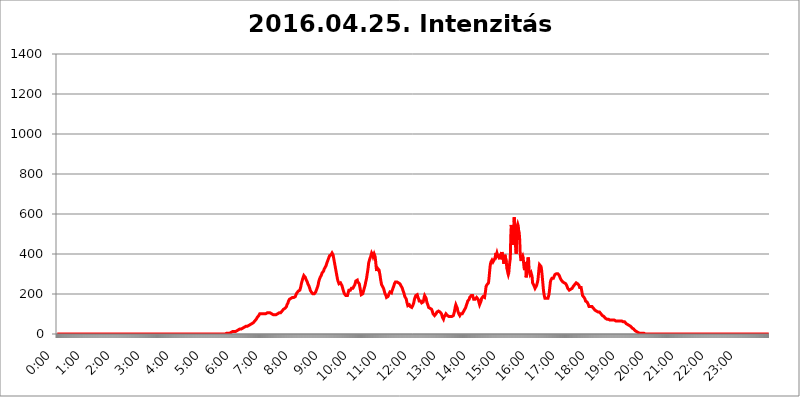
| Category | 2016.04.25. Intenzitás [W/m^2] |
|---|---|
| 0.0 | 0 |
| 0.0006944444444444445 | 0 |
| 0.001388888888888889 | 0 |
| 0.0020833333333333333 | 0 |
| 0.002777777777777778 | 0 |
| 0.003472222222222222 | 0 |
| 0.004166666666666667 | 0 |
| 0.004861111111111111 | 0 |
| 0.005555555555555556 | 0 |
| 0.0062499999999999995 | 0 |
| 0.006944444444444444 | 0 |
| 0.007638888888888889 | 0 |
| 0.008333333333333333 | 0 |
| 0.009027777777777779 | 0 |
| 0.009722222222222222 | 0 |
| 0.010416666666666666 | 0 |
| 0.011111111111111112 | 0 |
| 0.011805555555555555 | 0 |
| 0.012499999999999999 | 0 |
| 0.013194444444444444 | 0 |
| 0.013888888888888888 | 0 |
| 0.014583333333333332 | 0 |
| 0.015277777777777777 | 0 |
| 0.015972222222222224 | 0 |
| 0.016666666666666666 | 0 |
| 0.017361111111111112 | 0 |
| 0.018055555555555557 | 0 |
| 0.01875 | 0 |
| 0.019444444444444445 | 0 |
| 0.02013888888888889 | 0 |
| 0.020833333333333332 | 0 |
| 0.02152777777777778 | 0 |
| 0.022222222222222223 | 0 |
| 0.02291666666666667 | 0 |
| 0.02361111111111111 | 0 |
| 0.024305555555555556 | 0 |
| 0.024999999999999998 | 0 |
| 0.025694444444444447 | 0 |
| 0.02638888888888889 | 0 |
| 0.027083333333333334 | 0 |
| 0.027777777777777776 | 0 |
| 0.02847222222222222 | 0 |
| 0.029166666666666664 | 0 |
| 0.029861111111111113 | 0 |
| 0.030555555555555555 | 0 |
| 0.03125 | 0 |
| 0.03194444444444445 | 0 |
| 0.03263888888888889 | 0 |
| 0.03333333333333333 | 0 |
| 0.034027777777777775 | 0 |
| 0.034722222222222224 | 0 |
| 0.035416666666666666 | 0 |
| 0.036111111111111115 | 0 |
| 0.03680555555555556 | 0 |
| 0.0375 | 0 |
| 0.03819444444444444 | 0 |
| 0.03888888888888889 | 0 |
| 0.03958333333333333 | 0 |
| 0.04027777777777778 | 0 |
| 0.04097222222222222 | 0 |
| 0.041666666666666664 | 0 |
| 0.042361111111111106 | 0 |
| 0.04305555555555556 | 0 |
| 0.043750000000000004 | 0 |
| 0.044444444444444446 | 0 |
| 0.04513888888888889 | 0 |
| 0.04583333333333334 | 0 |
| 0.04652777777777778 | 0 |
| 0.04722222222222222 | 0 |
| 0.04791666666666666 | 0 |
| 0.04861111111111111 | 0 |
| 0.049305555555555554 | 0 |
| 0.049999999999999996 | 0 |
| 0.05069444444444445 | 0 |
| 0.051388888888888894 | 0 |
| 0.052083333333333336 | 0 |
| 0.05277777777777778 | 0 |
| 0.05347222222222222 | 0 |
| 0.05416666666666667 | 0 |
| 0.05486111111111111 | 0 |
| 0.05555555555555555 | 0 |
| 0.05625 | 0 |
| 0.05694444444444444 | 0 |
| 0.057638888888888885 | 0 |
| 0.05833333333333333 | 0 |
| 0.05902777777777778 | 0 |
| 0.059722222222222225 | 0 |
| 0.06041666666666667 | 0 |
| 0.061111111111111116 | 0 |
| 0.06180555555555556 | 0 |
| 0.0625 | 0 |
| 0.06319444444444444 | 0 |
| 0.06388888888888888 | 0 |
| 0.06458333333333334 | 0 |
| 0.06527777777777778 | 0 |
| 0.06597222222222222 | 0 |
| 0.06666666666666667 | 0 |
| 0.06736111111111111 | 0 |
| 0.06805555555555555 | 0 |
| 0.06874999999999999 | 0 |
| 0.06944444444444443 | 0 |
| 0.07013888888888889 | 0 |
| 0.07083333333333333 | 0 |
| 0.07152777777777779 | 0 |
| 0.07222222222222223 | 0 |
| 0.07291666666666667 | 0 |
| 0.07361111111111111 | 0 |
| 0.07430555555555556 | 0 |
| 0.075 | 0 |
| 0.07569444444444444 | 0 |
| 0.0763888888888889 | 0 |
| 0.07708333333333334 | 0 |
| 0.07777777777777778 | 0 |
| 0.07847222222222222 | 0 |
| 0.07916666666666666 | 0 |
| 0.0798611111111111 | 0 |
| 0.08055555555555556 | 0 |
| 0.08125 | 0 |
| 0.08194444444444444 | 0 |
| 0.08263888888888889 | 0 |
| 0.08333333333333333 | 0 |
| 0.08402777777777777 | 0 |
| 0.08472222222222221 | 0 |
| 0.08541666666666665 | 0 |
| 0.08611111111111112 | 0 |
| 0.08680555555555557 | 0 |
| 0.08750000000000001 | 0 |
| 0.08819444444444445 | 0 |
| 0.08888888888888889 | 0 |
| 0.08958333333333333 | 0 |
| 0.09027777777777778 | 0 |
| 0.09097222222222222 | 0 |
| 0.09166666666666667 | 0 |
| 0.09236111111111112 | 0 |
| 0.09305555555555556 | 0 |
| 0.09375 | 0 |
| 0.09444444444444444 | 0 |
| 0.09513888888888888 | 0 |
| 0.09583333333333333 | 0 |
| 0.09652777777777777 | 0 |
| 0.09722222222222222 | 0 |
| 0.09791666666666667 | 0 |
| 0.09861111111111111 | 0 |
| 0.09930555555555555 | 0 |
| 0.09999999999999999 | 0 |
| 0.10069444444444443 | 0 |
| 0.1013888888888889 | 0 |
| 0.10208333333333335 | 0 |
| 0.10277777777777779 | 0 |
| 0.10347222222222223 | 0 |
| 0.10416666666666667 | 0 |
| 0.10486111111111111 | 0 |
| 0.10555555555555556 | 0 |
| 0.10625 | 0 |
| 0.10694444444444444 | 0 |
| 0.1076388888888889 | 0 |
| 0.10833333333333334 | 0 |
| 0.10902777777777778 | 0 |
| 0.10972222222222222 | 0 |
| 0.1111111111111111 | 0 |
| 0.11180555555555556 | 0 |
| 0.11180555555555556 | 0 |
| 0.1125 | 0 |
| 0.11319444444444444 | 0 |
| 0.11388888888888889 | 0 |
| 0.11458333333333333 | 0 |
| 0.11527777777777777 | 0 |
| 0.11597222222222221 | 0 |
| 0.11666666666666665 | 0 |
| 0.1173611111111111 | 0 |
| 0.11805555555555557 | 0 |
| 0.11944444444444445 | 0 |
| 0.12013888888888889 | 0 |
| 0.12083333333333333 | 0 |
| 0.12152777777777778 | 0 |
| 0.12222222222222223 | 0 |
| 0.12291666666666667 | 0 |
| 0.12291666666666667 | 0 |
| 0.12361111111111112 | 0 |
| 0.12430555555555556 | 0 |
| 0.125 | 0 |
| 0.12569444444444444 | 0 |
| 0.12638888888888888 | 0 |
| 0.12708333333333333 | 0 |
| 0.16875 | 0 |
| 0.12847222222222224 | 0 |
| 0.12916666666666668 | 0 |
| 0.12986111111111112 | 0 |
| 0.13055555555555556 | 0 |
| 0.13125 | 0 |
| 0.13194444444444445 | 0 |
| 0.1326388888888889 | 0 |
| 0.13333333333333333 | 0 |
| 0.13402777777777777 | 0 |
| 0.13402777777777777 | 0 |
| 0.13472222222222222 | 0 |
| 0.13541666666666666 | 0 |
| 0.1361111111111111 | 0 |
| 0.13749999999999998 | 0 |
| 0.13819444444444443 | 0 |
| 0.1388888888888889 | 0 |
| 0.13958333333333334 | 0 |
| 0.14027777777777778 | 0 |
| 0.14097222222222222 | 0 |
| 0.14166666666666666 | 0 |
| 0.1423611111111111 | 0 |
| 0.14305555555555557 | 0 |
| 0.14375000000000002 | 0 |
| 0.14444444444444446 | 0 |
| 0.1451388888888889 | 0 |
| 0.1451388888888889 | 0 |
| 0.14652777777777778 | 0 |
| 0.14722222222222223 | 0 |
| 0.14791666666666667 | 0 |
| 0.1486111111111111 | 0 |
| 0.14930555555555555 | 0 |
| 0.15 | 0 |
| 0.15069444444444444 | 0 |
| 0.15138888888888888 | 0 |
| 0.15208333333333332 | 0 |
| 0.15277777777777776 | 0 |
| 0.15347222222222223 | 0 |
| 0.15416666666666667 | 0 |
| 0.15486111111111112 | 0 |
| 0.15555555555555556 | 0 |
| 0.15625 | 0 |
| 0.15694444444444444 | 0 |
| 0.15763888888888888 | 0 |
| 0.15833333333333333 | 0 |
| 0.15902777777777777 | 0 |
| 0.15972222222222224 | 0 |
| 0.16041666666666668 | 0 |
| 0.16111111111111112 | 0 |
| 0.16180555555555556 | 0 |
| 0.1625 | 0 |
| 0.16319444444444445 | 0 |
| 0.1638888888888889 | 0 |
| 0.16458333333333333 | 0 |
| 0.16527777777777777 | 0 |
| 0.16597222222222222 | 0 |
| 0.16666666666666666 | 0 |
| 0.1673611111111111 | 0 |
| 0.16805555555555554 | 0 |
| 0.16874999999999998 | 0 |
| 0.16944444444444443 | 0 |
| 0.17013888888888887 | 0 |
| 0.1708333333333333 | 0 |
| 0.17152777777777775 | 0 |
| 0.17222222222222225 | 0 |
| 0.1729166666666667 | 0 |
| 0.17361111111111113 | 0 |
| 0.17430555555555557 | 0 |
| 0.17500000000000002 | 0 |
| 0.17569444444444446 | 0 |
| 0.1763888888888889 | 0 |
| 0.17708333333333334 | 0 |
| 0.17777777777777778 | 0 |
| 0.17847222222222223 | 0 |
| 0.17916666666666667 | 0 |
| 0.1798611111111111 | 0 |
| 0.18055555555555555 | 0 |
| 0.18125 | 0 |
| 0.18194444444444444 | 0 |
| 0.1826388888888889 | 0 |
| 0.18333333333333335 | 0 |
| 0.1840277777777778 | 0 |
| 0.18472222222222223 | 0 |
| 0.18541666666666667 | 0 |
| 0.18611111111111112 | 0 |
| 0.18680555555555556 | 0 |
| 0.1875 | 0 |
| 0.18819444444444444 | 0 |
| 0.18888888888888888 | 0 |
| 0.18958333333333333 | 0 |
| 0.19027777777777777 | 0 |
| 0.1909722222222222 | 0 |
| 0.19166666666666665 | 0 |
| 0.19236111111111112 | 0 |
| 0.19305555555555554 | 0 |
| 0.19375 | 0 |
| 0.19444444444444445 | 0 |
| 0.1951388888888889 | 0 |
| 0.19583333333333333 | 0 |
| 0.19652777777777777 | 0 |
| 0.19722222222222222 | 0 |
| 0.19791666666666666 | 0 |
| 0.1986111111111111 | 0 |
| 0.19930555555555554 | 0 |
| 0.19999999999999998 | 0 |
| 0.20069444444444443 | 0 |
| 0.20138888888888887 | 0 |
| 0.2020833333333333 | 0 |
| 0.2027777777777778 | 0 |
| 0.2034722222222222 | 0 |
| 0.2041666666666667 | 0 |
| 0.20486111111111113 | 0 |
| 0.20555555555555557 | 0 |
| 0.20625000000000002 | 0 |
| 0.20694444444444446 | 0 |
| 0.2076388888888889 | 0 |
| 0.20833333333333334 | 0 |
| 0.20902777777777778 | 0 |
| 0.20972222222222223 | 0 |
| 0.21041666666666667 | 0 |
| 0.2111111111111111 | 0 |
| 0.21180555555555555 | 0 |
| 0.2125 | 0 |
| 0.21319444444444444 | 0 |
| 0.2138888888888889 | 0 |
| 0.21458333333333335 | 0 |
| 0.2152777777777778 | 0 |
| 0.21597222222222223 | 0 |
| 0.21666666666666667 | 0 |
| 0.21736111111111112 | 0 |
| 0.21805555555555556 | 0 |
| 0.21875 | 0 |
| 0.21944444444444444 | 0 |
| 0.22013888888888888 | 0 |
| 0.22083333333333333 | 0 |
| 0.22152777777777777 | 0 |
| 0.2222222222222222 | 0 |
| 0.22291666666666665 | 0 |
| 0.2236111111111111 | 0 |
| 0.22430555555555556 | 0 |
| 0.225 | 0 |
| 0.22569444444444445 | 0 |
| 0.2263888888888889 | 0 |
| 0.22708333333333333 | 0 |
| 0.22777777777777777 | 0 |
| 0.22847222222222222 | 0 |
| 0.22916666666666666 | 0 |
| 0.2298611111111111 | 0 |
| 0.23055555555555554 | 0 |
| 0.23124999999999998 | 0 |
| 0.23194444444444443 | 0 |
| 0.23263888888888887 | 0 |
| 0.2333333333333333 | 0 |
| 0.2340277777777778 | 0 |
| 0.2347222222222222 | 0 |
| 0.2354166666666667 | 0 |
| 0.23611111111111113 | 0 |
| 0.23680555555555557 | 3.525 |
| 0.23750000000000002 | 3.525 |
| 0.23819444444444446 | 3.525 |
| 0.2388888888888889 | 3.525 |
| 0.23958333333333334 | 3.525 |
| 0.24027777777777778 | 3.525 |
| 0.24097222222222223 | 3.525 |
| 0.24166666666666667 | 3.525 |
| 0.2423611111111111 | 7.887 |
| 0.24305555555555555 | 7.887 |
| 0.24375 | 7.887 |
| 0.24444444444444446 | 7.887 |
| 0.24513888888888888 | 7.887 |
| 0.24583333333333335 | 12.257 |
| 0.2465277777777778 | 12.257 |
| 0.24722222222222223 | 12.257 |
| 0.24791666666666667 | 12.257 |
| 0.24861111111111112 | 12.257 |
| 0.24930555555555556 | 12.257 |
| 0.25 | 12.257 |
| 0.25069444444444444 | 16.636 |
| 0.2513888888888889 | 16.636 |
| 0.2520833333333333 | 16.636 |
| 0.25277777777777777 | 16.636 |
| 0.2534722222222222 | 21.024 |
| 0.25416666666666665 | 21.024 |
| 0.2548611111111111 | 21.024 |
| 0.2555555555555556 | 21.024 |
| 0.25625000000000003 | 25.419 |
| 0.2569444444444445 | 25.419 |
| 0.2576388888888889 | 25.419 |
| 0.25833333333333336 | 25.419 |
| 0.2590277777777778 | 29.823 |
| 0.25972222222222224 | 29.823 |
| 0.2604166666666667 | 29.823 |
| 0.2611111111111111 | 29.823 |
| 0.26180555555555557 | 29.823 |
| 0.2625 | 34.234 |
| 0.26319444444444445 | 34.234 |
| 0.2638888888888889 | 34.234 |
| 0.26458333333333334 | 38.653 |
| 0.2652777777777778 | 38.653 |
| 0.2659722222222222 | 38.653 |
| 0.26666666666666666 | 38.653 |
| 0.2673611111111111 | 43.079 |
| 0.26805555555555555 | 43.079 |
| 0.26875 | 43.079 |
| 0.26944444444444443 | 43.079 |
| 0.2701388888888889 | 47.511 |
| 0.2708333333333333 | 47.511 |
| 0.27152777777777776 | 47.511 |
| 0.2722222222222222 | 47.511 |
| 0.27291666666666664 | 51.951 |
| 0.2736111111111111 | 51.951 |
| 0.2743055555555555 | 56.398 |
| 0.27499999999999997 | 56.398 |
| 0.27569444444444446 | 60.85 |
| 0.27638888888888885 | 60.85 |
| 0.27708333333333335 | 65.31 |
| 0.2777777777777778 | 69.775 |
| 0.27847222222222223 | 69.775 |
| 0.2791666666666667 | 74.246 |
| 0.2798611111111111 | 78.722 |
| 0.28055555555555556 | 83.205 |
| 0.28125 | 83.205 |
| 0.28194444444444444 | 87.692 |
| 0.2826388888888889 | 92.184 |
| 0.2833333333333333 | 96.682 |
| 0.28402777777777777 | 101.184 |
| 0.2847222222222222 | 101.184 |
| 0.28541666666666665 | 101.184 |
| 0.28611111111111115 | 101.184 |
| 0.28680555555555554 | 101.184 |
| 0.28750000000000003 | 101.184 |
| 0.2881944444444445 | 101.184 |
| 0.2888888888888889 | 101.184 |
| 0.28958333333333336 | 101.184 |
| 0.2902777777777778 | 101.184 |
| 0.29097222222222224 | 101.184 |
| 0.2916666666666667 | 101.184 |
| 0.2923611111111111 | 101.184 |
| 0.29305555555555557 | 101.184 |
| 0.29375 | 101.184 |
| 0.29444444444444445 | 105.69 |
| 0.2951388888888889 | 105.69 |
| 0.29583333333333334 | 105.69 |
| 0.2965277777777778 | 105.69 |
| 0.2972222222222222 | 105.69 |
| 0.29791666666666666 | 105.69 |
| 0.2986111111111111 | 105.69 |
| 0.29930555555555555 | 105.69 |
| 0.3 | 101.184 |
| 0.30069444444444443 | 101.184 |
| 0.3013888888888889 | 101.184 |
| 0.3020833333333333 | 96.682 |
| 0.30277777777777776 | 96.682 |
| 0.3034722222222222 | 96.682 |
| 0.30416666666666664 | 96.682 |
| 0.3048611111111111 | 96.682 |
| 0.3055555555555555 | 96.682 |
| 0.30624999999999997 | 96.682 |
| 0.3069444444444444 | 96.682 |
| 0.3076388888888889 | 101.184 |
| 0.30833333333333335 | 101.184 |
| 0.3090277777777778 | 101.184 |
| 0.30972222222222223 | 105.69 |
| 0.3104166666666667 | 105.69 |
| 0.3111111111111111 | 105.69 |
| 0.31180555555555556 | 105.69 |
| 0.3125 | 110.201 |
| 0.31319444444444444 | 105.69 |
| 0.3138888888888889 | 110.201 |
| 0.3145833333333333 | 110.201 |
| 0.31527777777777777 | 114.716 |
| 0.3159722222222222 | 119.235 |
| 0.31666666666666665 | 119.235 |
| 0.31736111111111115 | 123.758 |
| 0.31805555555555554 | 128.284 |
| 0.31875000000000003 | 128.284 |
| 0.3194444444444445 | 128.284 |
| 0.3201388888888889 | 132.814 |
| 0.32083333333333336 | 132.814 |
| 0.3215277777777778 | 137.347 |
| 0.32222222222222224 | 146.423 |
| 0.3229166666666667 | 150.964 |
| 0.3236111111111111 | 155.509 |
| 0.32430555555555557 | 164.605 |
| 0.325 | 169.156 |
| 0.32569444444444445 | 173.709 |
| 0.3263888888888889 | 173.709 |
| 0.32708333333333334 | 173.709 |
| 0.3277777777777778 | 178.264 |
| 0.3284722222222222 | 178.264 |
| 0.32916666666666666 | 178.264 |
| 0.3298611111111111 | 182.82 |
| 0.33055555555555555 | 182.82 |
| 0.33125 | 182.82 |
| 0.33194444444444443 | 182.82 |
| 0.3326388888888889 | 182.82 |
| 0.3333333333333333 | 182.82 |
| 0.3340277777777778 | 187.378 |
| 0.3347222222222222 | 196.497 |
| 0.3354166666666667 | 201.058 |
| 0.3361111111111111 | 205.62 |
| 0.3368055555555556 | 210.182 |
| 0.33749999999999997 | 210.182 |
| 0.33819444444444446 | 214.746 |
| 0.33888888888888885 | 219.309 |
| 0.33958333333333335 | 219.309 |
| 0.34027777777777773 | 219.309 |
| 0.34097222222222223 | 228.436 |
| 0.3416666666666666 | 237.564 |
| 0.3423611111111111 | 251.251 |
| 0.3430555555555555 | 260.373 |
| 0.34375 | 269.49 |
| 0.3444444444444445 | 278.603 |
| 0.3451388888888889 | 283.156 |
| 0.3458333333333334 | 292.259 |
| 0.34652777777777777 | 292.259 |
| 0.34722222222222227 | 287.709 |
| 0.34791666666666665 | 283.156 |
| 0.34861111111111115 | 278.603 |
| 0.34930555555555554 | 269.49 |
| 0.35000000000000003 | 264.932 |
| 0.3506944444444444 | 260.373 |
| 0.3513888888888889 | 251.251 |
| 0.3520833333333333 | 246.689 |
| 0.3527777777777778 | 242.127 |
| 0.3534722222222222 | 237.564 |
| 0.3541666666666667 | 228.436 |
| 0.3548611111111111 | 219.309 |
| 0.35555555555555557 | 214.746 |
| 0.35625 | 210.182 |
| 0.35694444444444445 | 205.62 |
| 0.3576388888888889 | 205.62 |
| 0.35833333333333334 | 201.058 |
| 0.3590277777777778 | 201.058 |
| 0.3597222222222222 | 201.058 |
| 0.36041666666666666 | 201.058 |
| 0.3611111111111111 | 201.058 |
| 0.36180555555555555 | 205.62 |
| 0.3625 | 210.182 |
| 0.36319444444444443 | 214.746 |
| 0.3638888888888889 | 223.873 |
| 0.3645833333333333 | 228.436 |
| 0.3652777777777778 | 237.564 |
| 0.3659722222222222 | 246.689 |
| 0.3666666666666667 | 260.373 |
| 0.3673611111111111 | 269.49 |
| 0.3680555555555556 | 274.047 |
| 0.36874999999999997 | 283.156 |
| 0.36944444444444446 | 287.709 |
| 0.37013888888888885 | 292.259 |
| 0.37083333333333335 | 296.808 |
| 0.37152777777777773 | 305.898 |
| 0.37222222222222223 | 305.898 |
| 0.3729166666666666 | 310.44 |
| 0.3736111111111111 | 314.98 |
| 0.3743055555555555 | 324.052 |
| 0.375 | 328.584 |
| 0.3756944444444445 | 333.113 |
| 0.3763888888888889 | 333.113 |
| 0.3770833333333334 | 342.162 |
| 0.37777777777777777 | 351.198 |
| 0.37847222222222227 | 355.712 |
| 0.37916666666666665 | 364.728 |
| 0.37986111111111115 | 369.23 |
| 0.38055555555555554 | 378.224 |
| 0.38125000000000003 | 382.715 |
| 0.3819444444444444 | 391.685 |
| 0.3826388888888889 | 396.164 |
| 0.3833333333333333 | 396.164 |
| 0.3840277777777778 | 396.164 |
| 0.3847222222222222 | 400.638 |
| 0.3854166666666667 | 405.108 |
| 0.3861111111111111 | 405.108 |
| 0.38680555555555557 | 396.164 |
| 0.3875 | 382.715 |
| 0.38819444444444445 | 369.23 |
| 0.3888888888888889 | 355.712 |
| 0.38958333333333334 | 342.162 |
| 0.3902777777777778 | 328.584 |
| 0.3909722222222222 | 314.98 |
| 0.39166666666666666 | 301.354 |
| 0.3923611111111111 | 287.709 |
| 0.39305555555555555 | 274.047 |
| 0.39375 | 264.932 |
| 0.39444444444444443 | 260.373 |
| 0.3951388888888889 | 251.251 |
| 0.3958333333333333 | 251.251 |
| 0.3965277777777778 | 251.251 |
| 0.3972222222222222 | 255.813 |
| 0.3979166666666667 | 255.813 |
| 0.3986111111111111 | 251.251 |
| 0.3993055555555556 | 242.127 |
| 0.39999999999999997 | 233 |
| 0.40069444444444446 | 223.873 |
| 0.40138888888888885 | 214.746 |
| 0.40208333333333335 | 210.182 |
| 0.40277777777777773 | 201.058 |
| 0.40347222222222223 | 196.497 |
| 0.4041666666666666 | 196.497 |
| 0.4048611111111111 | 191.937 |
| 0.4055555555555555 | 187.378 |
| 0.40625 | 187.378 |
| 0.4069444444444445 | 191.937 |
| 0.4076388888888889 | 201.058 |
| 0.4083333333333334 | 210.182 |
| 0.40902777777777777 | 219.309 |
| 0.40972222222222227 | 219.309 |
| 0.41041666666666665 | 219.309 |
| 0.41111111111111115 | 219.309 |
| 0.41180555555555554 | 223.873 |
| 0.41250000000000003 | 228.436 |
| 0.4131944444444444 | 233 |
| 0.4138888888888889 | 233 |
| 0.4145833333333333 | 228.436 |
| 0.4152777777777778 | 233 |
| 0.4159722222222222 | 237.564 |
| 0.4166666666666667 | 242.127 |
| 0.4173611111111111 | 246.689 |
| 0.41805555555555557 | 251.251 |
| 0.41875 | 264.932 |
| 0.41944444444444445 | 269.49 |
| 0.4201388888888889 | 269.49 |
| 0.42083333333333334 | 269.49 |
| 0.4215277777777778 | 260.373 |
| 0.4222222222222222 | 255.813 |
| 0.42291666666666666 | 255.813 |
| 0.4236111111111111 | 251.251 |
| 0.42430555555555555 | 237.564 |
| 0.425 | 223.873 |
| 0.42569444444444443 | 210.182 |
| 0.4263888888888889 | 196.497 |
| 0.4270833333333333 | 196.497 |
| 0.4277777777777778 | 196.497 |
| 0.4284722222222222 | 201.058 |
| 0.4291666666666667 | 210.182 |
| 0.4298611111111111 | 219.309 |
| 0.4305555555555556 | 228.436 |
| 0.43124999999999997 | 233 |
| 0.43194444444444446 | 246.689 |
| 0.43263888888888885 | 260.373 |
| 0.43333333333333335 | 269.49 |
| 0.43402777777777773 | 283.156 |
| 0.43472222222222223 | 301.354 |
| 0.4354166666666666 | 314.98 |
| 0.4361111111111111 | 333.113 |
| 0.4368055555555555 | 355.712 |
| 0.4375 | 364.728 |
| 0.4381944444444445 | 373.729 |
| 0.4388888888888889 | 378.224 |
| 0.4395833333333334 | 387.202 |
| 0.44027777777777777 | 396.164 |
| 0.44097222222222227 | 405.108 |
| 0.44166666666666665 | 409.574 |
| 0.44236111111111115 | 396.164 |
| 0.44305555555555554 | 387.202 |
| 0.44375000000000003 | 391.685 |
| 0.4444444444444444 | 400.638 |
| 0.4451388888888889 | 396.164 |
| 0.4458333333333333 | 387.202 |
| 0.4465277777777778 | 364.728 |
| 0.4472222222222222 | 337.639 |
| 0.4479166666666667 | 314.98 |
| 0.4486111111111111 | 314.98 |
| 0.44930555555555557 | 328.584 |
| 0.45 | 333.113 |
| 0.45069444444444445 | 324.052 |
| 0.4513888888888889 | 319.517 |
| 0.45208333333333334 | 305.898 |
| 0.4527777777777778 | 292.259 |
| 0.4534722222222222 | 274.047 |
| 0.45416666666666666 | 260.373 |
| 0.4548611111111111 | 246.689 |
| 0.45555555555555555 | 242.127 |
| 0.45625 | 237.564 |
| 0.45694444444444443 | 233 |
| 0.4576388888888889 | 228.436 |
| 0.4583333333333333 | 219.309 |
| 0.4590277777777778 | 210.182 |
| 0.4597222222222222 | 201.058 |
| 0.4604166666666667 | 196.497 |
| 0.4611111111111111 | 191.937 |
| 0.4618055555555556 | 182.82 |
| 0.46249999999999997 | 182.82 |
| 0.46319444444444446 | 182.82 |
| 0.46388888888888885 | 187.378 |
| 0.46458333333333335 | 191.937 |
| 0.46527777777777773 | 201.058 |
| 0.46597222222222223 | 205.62 |
| 0.4666666666666666 | 210.182 |
| 0.4673611111111111 | 205.62 |
| 0.4680555555555555 | 205.62 |
| 0.46875 | 205.62 |
| 0.4694444444444445 | 214.746 |
| 0.4701388888888889 | 219.309 |
| 0.4708333333333334 | 228.436 |
| 0.47152777777777777 | 233 |
| 0.47222222222222227 | 242.127 |
| 0.47291666666666665 | 251.251 |
| 0.47361111111111115 | 255.813 |
| 0.47430555555555554 | 260.373 |
| 0.47500000000000003 | 260.373 |
| 0.4756944444444444 | 260.373 |
| 0.4763888888888889 | 260.373 |
| 0.4770833333333333 | 260.373 |
| 0.4777777777777778 | 255.813 |
| 0.4784722222222222 | 255.813 |
| 0.4791666666666667 | 255.813 |
| 0.4798611111111111 | 255.813 |
| 0.48055555555555557 | 251.251 |
| 0.48125 | 251.251 |
| 0.48194444444444445 | 246.689 |
| 0.4826388888888889 | 237.564 |
| 0.48333333333333334 | 233 |
| 0.4840277777777778 | 228.436 |
| 0.4847222222222222 | 219.309 |
| 0.48541666666666666 | 214.746 |
| 0.4861111111111111 | 205.62 |
| 0.48680555555555555 | 196.497 |
| 0.4875 | 187.378 |
| 0.48819444444444443 | 182.82 |
| 0.4888888888888889 | 182.82 |
| 0.4895833333333333 | 173.709 |
| 0.4902777777777778 | 160.056 |
| 0.4909722222222222 | 150.964 |
| 0.4916666666666667 | 141.884 |
| 0.4923611111111111 | 141.884 |
| 0.4930555555555556 | 141.884 |
| 0.49374999999999997 | 146.423 |
| 0.49444444444444446 | 146.423 |
| 0.49513888888888885 | 137.347 |
| 0.49583333333333335 | 132.814 |
| 0.49652777777777773 | 132.814 |
| 0.49722222222222223 | 132.814 |
| 0.4979166666666666 | 137.347 |
| 0.4986111111111111 | 141.884 |
| 0.4993055555555555 | 146.423 |
| 0.5 | 155.509 |
| 0.5006944444444444 | 169.156 |
| 0.5013888888888889 | 178.264 |
| 0.5020833333333333 | 182.82 |
| 0.5027777777777778 | 191.937 |
| 0.5034722222222222 | 196.497 |
| 0.5041666666666667 | 196.497 |
| 0.5048611111111111 | 196.497 |
| 0.5055555555555555 | 187.378 |
| 0.50625 | 182.82 |
| 0.5069444444444444 | 173.709 |
| 0.5076388888888889 | 164.605 |
| 0.5083333333333333 | 160.056 |
| 0.5090277777777777 | 164.605 |
| 0.5097222222222222 | 164.605 |
| 0.5104166666666666 | 164.605 |
| 0.5111111111111112 | 155.509 |
| 0.5118055555555555 | 150.964 |
| 0.5125000000000001 | 150.964 |
| 0.5131944444444444 | 160.056 |
| 0.513888888888889 | 169.156 |
| 0.5145833333333333 | 182.82 |
| 0.5152777777777778 | 191.937 |
| 0.5159722222222222 | 191.937 |
| 0.5166666666666667 | 187.378 |
| 0.517361111111111 | 178.264 |
| 0.5180555555555556 | 164.605 |
| 0.5187499999999999 | 155.509 |
| 0.5194444444444445 | 150.964 |
| 0.5201388888888888 | 141.884 |
| 0.5208333333333334 | 132.814 |
| 0.5215277777777778 | 132.814 |
| 0.5222222222222223 | 128.284 |
| 0.5229166666666667 | 128.284 |
| 0.5236111111111111 | 128.284 |
| 0.5243055555555556 | 123.758 |
| 0.525 | 123.758 |
| 0.5256944444444445 | 119.235 |
| 0.5263888888888889 | 110.201 |
| 0.5270833333333333 | 101.184 |
| 0.5277777777777778 | 96.682 |
| 0.5284722222222222 | 96.682 |
| 0.5291666666666667 | 92.184 |
| 0.5298611111111111 | 87.692 |
| 0.5305555555555556 | 92.184 |
| 0.53125 | 101.184 |
| 0.5319444444444444 | 105.69 |
| 0.5326388888888889 | 110.201 |
| 0.5333333333333333 | 110.201 |
| 0.5340277777777778 | 114.716 |
| 0.5347222222222222 | 114.716 |
| 0.5354166666666667 | 114.716 |
| 0.5361111111111111 | 110.201 |
| 0.5368055555555555 | 110.201 |
| 0.5375 | 110.201 |
| 0.5381944444444444 | 105.69 |
| 0.5388888888888889 | 101.184 |
| 0.5395833333333333 | 92.184 |
| 0.5402777777777777 | 83.205 |
| 0.5409722222222222 | 78.722 |
| 0.5416666666666666 | 74.246 |
| 0.5423611111111112 | 83.205 |
| 0.5430555555555555 | 87.692 |
| 0.5437500000000001 | 92.184 |
| 0.5444444444444444 | 96.682 |
| 0.545138888888889 | 101.184 |
| 0.5458333333333333 | 101.184 |
| 0.5465277777777778 | 96.682 |
| 0.5472222222222222 | 92.184 |
| 0.5479166666666667 | 92.184 |
| 0.548611111111111 | 92.184 |
| 0.5493055555555556 | 87.692 |
| 0.5499999999999999 | 83.205 |
| 0.5506944444444445 | 83.205 |
| 0.5513888888888888 | 87.692 |
| 0.5520833333333334 | 92.184 |
| 0.5527777777777778 | 92.184 |
| 0.5534722222222223 | 87.692 |
| 0.5541666666666667 | 83.205 |
| 0.5548611111111111 | 87.692 |
| 0.5555555555555556 | 92.184 |
| 0.55625 | 96.682 |
| 0.5569444444444445 | 110.201 |
| 0.5576388888888889 | 123.758 |
| 0.5583333333333333 | 137.347 |
| 0.5590277777777778 | 146.423 |
| 0.5597222222222222 | 150.964 |
| 0.5604166666666667 | 141.884 |
| 0.5611111111111111 | 128.284 |
| 0.5618055555555556 | 114.716 |
| 0.5625 | 110.201 |
| 0.5631944444444444 | 101.184 |
| 0.5638888888888889 | 96.682 |
| 0.5645833333333333 | 92.184 |
| 0.5652777777777778 | 92.184 |
| 0.5659722222222222 | 101.184 |
| 0.5666666666666667 | 105.69 |
| 0.5673611111111111 | 105.69 |
| 0.5680555555555555 | 101.184 |
| 0.56875 | 101.184 |
| 0.5694444444444444 | 110.201 |
| 0.5701388888888889 | 114.716 |
| 0.5708333333333333 | 119.235 |
| 0.5715277777777777 | 119.235 |
| 0.5722222222222222 | 123.758 |
| 0.5729166666666666 | 132.814 |
| 0.5736111111111112 | 141.884 |
| 0.5743055555555555 | 146.423 |
| 0.5750000000000001 | 155.509 |
| 0.5756944444444444 | 164.605 |
| 0.576388888888889 | 164.605 |
| 0.5770833333333333 | 169.156 |
| 0.5777777777777778 | 173.709 |
| 0.5784722222222222 | 182.82 |
| 0.5791666666666667 | 182.82 |
| 0.579861111111111 | 182.82 |
| 0.5805555555555556 | 191.937 |
| 0.5812499999999999 | 196.497 |
| 0.5819444444444445 | 191.937 |
| 0.5826388888888888 | 191.937 |
| 0.5833333333333334 | 182.82 |
| 0.5840277777777778 | 173.709 |
| 0.5847222222222223 | 169.156 |
| 0.5854166666666667 | 173.709 |
| 0.5861111111111111 | 173.709 |
| 0.5868055555555556 | 173.709 |
| 0.5875 | 173.709 |
| 0.5881944444444445 | 182.82 |
| 0.5888888888888889 | 187.378 |
| 0.5895833333333333 | 178.264 |
| 0.5902777777777778 | 173.709 |
| 0.5909722222222222 | 164.605 |
| 0.5916666666666667 | 155.509 |
| 0.5923611111111111 | 146.423 |
| 0.5930555555555556 | 146.423 |
| 0.59375 | 150.964 |
| 0.5944444444444444 | 164.605 |
| 0.5951388888888889 | 178.264 |
| 0.5958333333333333 | 182.82 |
| 0.5965277777777778 | 182.82 |
| 0.5972222222222222 | 187.378 |
| 0.5979166666666667 | 191.937 |
| 0.5986111111111111 | 187.378 |
| 0.5993055555555555 | 182.82 |
| 0.6 | 187.378 |
| 0.6006944444444444 | 214.746 |
| 0.6013888888888889 | 237.564 |
| 0.6020833333333333 | 242.127 |
| 0.6027777777777777 | 246.689 |
| 0.6034722222222222 | 242.127 |
| 0.6041666666666666 | 246.689 |
| 0.6048611111111112 | 255.813 |
| 0.6055555555555555 | 278.603 |
| 0.6062500000000001 | 305.898 |
| 0.6069444444444444 | 333.113 |
| 0.607638888888889 | 351.198 |
| 0.6083333333333333 | 360.221 |
| 0.6090277777777778 | 364.728 |
| 0.6097222222222222 | 369.23 |
| 0.6104166666666667 | 364.728 |
| 0.611111111111111 | 360.221 |
| 0.6118055555555556 | 360.221 |
| 0.6124999999999999 | 369.23 |
| 0.6131944444444445 | 373.729 |
| 0.6138888888888888 | 378.224 |
| 0.6145833333333334 | 391.685 |
| 0.6152777777777778 | 405.108 |
| 0.6159722222222223 | 396.164 |
| 0.6166666666666667 | 405.108 |
| 0.6173611111111111 | 396.164 |
| 0.6180555555555556 | 396.164 |
| 0.61875 | 387.202 |
| 0.6194444444444445 | 387.202 |
| 0.6201388888888889 | 400.638 |
| 0.6208333333333333 | 382.715 |
| 0.6215277777777778 | 373.729 |
| 0.6222222222222222 | 369.23 |
| 0.6229166666666667 | 369.23 |
| 0.6236111111111111 | 409.574 |
| 0.6243055555555556 | 409.574 |
| 0.625 | 387.202 |
| 0.6256944444444444 | 369.23 |
| 0.6263888888888889 | 351.198 |
| 0.6270833333333333 | 346.682 |
| 0.6277777777777778 | 396.164 |
| 0.6284722222222222 | 391.685 |
| 0.6291666666666667 | 391.685 |
| 0.6298611111111111 | 360.221 |
| 0.6305555555555555 | 328.584 |
| 0.63125 | 319.517 |
| 0.6319444444444444 | 305.898 |
| 0.6326388888888889 | 296.808 |
| 0.6333333333333333 | 305.898 |
| 0.6340277777777777 | 337.639 |
| 0.6347222222222222 | 360.221 |
| 0.6354166666666666 | 378.224 |
| 0.6361111111111112 | 489.108 |
| 0.6368055555555555 | 545.416 |
| 0.6375000000000001 | 510.885 |
| 0.6381944444444444 | 458.38 |
| 0.638888888888889 | 445.129 |
| 0.6395833333333333 | 440.702 |
| 0.6402777777777778 | 515.223 |
| 0.6409722222222222 | 583.779 |
| 0.6416666666666667 | 489.108 |
| 0.642361111111111 | 449.551 |
| 0.6430555555555556 | 427.39 |
| 0.6437499999999999 | 400.638 |
| 0.6444444444444445 | 489.108 |
| 0.6451388888888888 | 541.121 |
| 0.6458333333333334 | 549.704 |
| 0.6465277777777778 | 541.121 |
| 0.6472222222222223 | 515.223 |
| 0.6479166666666667 | 506.542 |
| 0.6486111111111111 | 471.582 |
| 0.6493055555555556 | 400.638 |
| 0.65 | 378.224 |
| 0.6506944444444445 | 364.728 |
| 0.6513888888888889 | 382.715 |
| 0.6520833333333333 | 378.224 |
| 0.6527777777777778 | 391.685 |
| 0.6534722222222222 | 382.715 |
| 0.6541666666666667 | 351.198 |
| 0.6548611111111111 | 328.584 |
| 0.6555555555555556 | 319.517 |
| 0.65625 | 360.221 |
| 0.6569444444444444 | 346.682 |
| 0.6576388888888889 | 283.156 |
| 0.6583333333333333 | 296.808 |
| 0.6590277777777778 | 342.162 |
| 0.6597222222222222 | 364.728 |
| 0.6604166666666667 | 382.715 |
| 0.6611111111111111 | 369.23 |
| 0.6618055555555555 | 314.98 |
| 0.6625 | 305.898 |
| 0.6631944444444444 | 296.808 |
| 0.6638888888888889 | 301.354 |
| 0.6645833333333333 | 305.898 |
| 0.6652777777777777 | 301.354 |
| 0.6659722222222222 | 287.709 |
| 0.6666666666666666 | 255.813 |
| 0.6673611111111111 | 260.373 |
| 0.6680555555555556 | 246.689 |
| 0.6687500000000001 | 246.689 |
| 0.6694444444444444 | 242.127 |
| 0.6701388888888888 | 228.436 |
| 0.6708333333333334 | 228.436 |
| 0.6715277777777778 | 228.436 |
| 0.6722222222222222 | 242.127 |
| 0.6729166666666666 | 246.689 |
| 0.6736111111111112 | 260.373 |
| 0.6743055555555556 | 274.047 |
| 0.6749999999999999 | 301.354 |
| 0.6756944444444444 | 328.584 |
| 0.6763888888888889 | 346.682 |
| 0.6770833333333334 | 351.198 |
| 0.6777777777777777 | 342.162 |
| 0.6784722222222223 | 337.639 |
| 0.6791666666666667 | 324.052 |
| 0.6798611111111111 | 301.354 |
| 0.6805555555555555 | 274.047 |
| 0.68125 | 246.689 |
| 0.6819444444444445 | 219.309 |
| 0.6826388888888889 | 201.058 |
| 0.6833333333333332 | 187.378 |
| 0.6840277777777778 | 178.264 |
| 0.6847222222222222 | 178.264 |
| 0.6854166666666667 | 178.264 |
| 0.686111111111111 | 178.264 |
| 0.6868055555555556 | 178.264 |
| 0.6875 | 178.264 |
| 0.6881944444444444 | 178.264 |
| 0.688888888888889 | 182.82 |
| 0.6895833333333333 | 196.497 |
| 0.6902777777777778 | 214.746 |
| 0.6909722222222222 | 237.564 |
| 0.6916666666666668 | 260.373 |
| 0.6923611111111111 | 269.49 |
| 0.6930555555555555 | 274.047 |
| 0.69375 | 278.603 |
| 0.6944444444444445 | 278.603 |
| 0.6951388888888889 | 278.603 |
| 0.6958333333333333 | 278.603 |
| 0.6965277777777777 | 278.603 |
| 0.6972222222222223 | 283.156 |
| 0.6979166666666666 | 296.808 |
| 0.6986111111111111 | 296.808 |
| 0.6993055555555556 | 301.354 |
| 0.7000000000000001 | 301.354 |
| 0.7006944444444444 | 301.354 |
| 0.7013888888888888 | 301.354 |
| 0.7020833333333334 | 301.354 |
| 0.7027777777777778 | 301.354 |
| 0.7034722222222222 | 296.808 |
| 0.7041666666666666 | 292.259 |
| 0.7048611111111112 | 287.709 |
| 0.7055555555555556 | 278.603 |
| 0.7062499999999999 | 278.603 |
| 0.7069444444444444 | 269.49 |
| 0.7076388888888889 | 269.49 |
| 0.7083333333333334 | 264.932 |
| 0.7090277777777777 | 260.373 |
| 0.7097222222222223 | 260.373 |
| 0.7104166666666667 | 260.373 |
| 0.7111111111111111 | 255.813 |
| 0.7118055555555555 | 251.251 |
| 0.7125 | 251.251 |
| 0.7131944444444445 | 251.251 |
| 0.7138888888888889 | 251.251 |
| 0.7145833333333332 | 242.127 |
| 0.7152777777777778 | 237.564 |
| 0.7159722222222222 | 228.436 |
| 0.7166666666666667 | 223.873 |
| 0.717361111111111 | 223.873 |
| 0.7180555555555556 | 219.309 |
| 0.71875 | 219.309 |
| 0.7194444444444444 | 223.873 |
| 0.720138888888889 | 223.873 |
| 0.7208333333333333 | 223.873 |
| 0.7215277777777778 | 228.436 |
| 0.7222222222222222 | 228.436 |
| 0.7229166666666668 | 233 |
| 0.7236111111111111 | 237.564 |
| 0.7243055555555555 | 242.127 |
| 0.725 | 242.127 |
| 0.7256944444444445 | 246.689 |
| 0.7263888888888889 | 251.251 |
| 0.7270833333333333 | 251.251 |
| 0.7277777777777777 | 255.813 |
| 0.7284722222222223 | 255.813 |
| 0.7291666666666666 | 255.813 |
| 0.7298611111111111 | 251.251 |
| 0.7305555555555556 | 246.689 |
| 0.7312500000000001 | 246.689 |
| 0.7319444444444444 | 242.127 |
| 0.7326388888888888 | 233 |
| 0.7333333333333334 | 233 |
| 0.7340277777777778 | 233 |
| 0.7347222222222222 | 233 |
| 0.7354166666666666 | 228.436 |
| 0.7361111111111112 | 205.62 |
| 0.7368055555555556 | 191.937 |
| 0.7374999999999999 | 191.937 |
| 0.7381944444444444 | 187.378 |
| 0.7388888888888889 | 182.82 |
| 0.7395833333333334 | 178.264 |
| 0.7402777777777777 | 173.709 |
| 0.7409722222222223 | 164.605 |
| 0.7416666666666667 | 160.056 |
| 0.7423611111111111 | 160.056 |
| 0.7430555555555555 | 160.056 |
| 0.74375 | 155.509 |
| 0.7444444444444445 | 150.964 |
| 0.7451388888888889 | 146.423 |
| 0.7458333333333332 | 137.347 |
| 0.7465277777777778 | 132.814 |
| 0.7472222222222222 | 132.814 |
| 0.7479166666666667 | 137.347 |
| 0.748611111111111 | 137.347 |
| 0.7493055555555556 | 141.884 |
| 0.75 | 137.347 |
| 0.7506944444444444 | 132.814 |
| 0.751388888888889 | 132.814 |
| 0.7520833333333333 | 128.284 |
| 0.7527777777777778 | 128.284 |
| 0.7534722222222222 | 123.758 |
| 0.7541666666666668 | 119.235 |
| 0.7548611111111111 | 119.235 |
| 0.7555555555555555 | 114.716 |
| 0.75625 | 114.716 |
| 0.7569444444444445 | 110.201 |
| 0.7576388888888889 | 110.201 |
| 0.7583333333333333 | 110.201 |
| 0.7590277777777777 | 110.201 |
| 0.7597222222222223 | 110.201 |
| 0.7604166666666666 | 110.201 |
| 0.7611111111111111 | 105.69 |
| 0.7618055555555556 | 105.69 |
| 0.7625000000000001 | 101.184 |
| 0.7631944444444444 | 101.184 |
| 0.7638888888888888 | 96.682 |
| 0.7645833333333334 | 92.184 |
| 0.7652777777777778 | 92.184 |
| 0.7659722222222222 | 87.692 |
| 0.7666666666666666 | 87.692 |
| 0.7673611111111112 | 83.205 |
| 0.7680555555555556 | 83.205 |
| 0.7687499999999999 | 78.722 |
| 0.7694444444444444 | 78.722 |
| 0.7701388888888889 | 78.722 |
| 0.7708333333333334 | 74.246 |
| 0.7715277777777777 | 74.246 |
| 0.7722222222222223 | 74.246 |
| 0.7729166666666667 | 74.246 |
| 0.7736111111111111 | 74.246 |
| 0.7743055555555555 | 74.246 |
| 0.775 | 69.775 |
| 0.7756944444444445 | 69.775 |
| 0.7763888888888889 | 69.775 |
| 0.7770833333333332 | 69.775 |
| 0.7777777777777778 | 69.775 |
| 0.7784722222222222 | 69.775 |
| 0.7791666666666667 | 69.775 |
| 0.779861111111111 | 69.775 |
| 0.7805555555555556 | 69.775 |
| 0.78125 | 69.775 |
| 0.7819444444444444 | 65.31 |
| 0.782638888888889 | 65.31 |
| 0.7833333333333333 | 65.31 |
| 0.7840277777777778 | 65.31 |
| 0.7847222222222222 | 65.31 |
| 0.7854166666666668 | 65.31 |
| 0.7861111111111111 | 65.31 |
| 0.7868055555555555 | 65.31 |
| 0.7875 | 65.31 |
| 0.7881944444444445 | 65.31 |
| 0.7888888888888889 | 65.31 |
| 0.7895833333333333 | 65.31 |
| 0.7902777777777777 | 65.31 |
| 0.7909722222222223 | 65.31 |
| 0.7916666666666666 | 65.31 |
| 0.7923611111111111 | 65.31 |
| 0.7930555555555556 | 60.85 |
| 0.7937500000000001 | 60.85 |
| 0.7944444444444444 | 60.85 |
| 0.7951388888888888 | 60.85 |
| 0.7958333333333334 | 60.85 |
| 0.7965277777777778 | 56.398 |
| 0.7972222222222222 | 56.398 |
| 0.7979166666666666 | 51.951 |
| 0.7986111111111112 | 51.951 |
| 0.7993055555555556 | 47.511 |
| 0.7999999999999999 | 47.511 |
| 0.8006944444444444 | 47.511 |
| 0.8013888888888889 | 47.511 |
| 0.8020833333333334 | 43.079 |
| 0.8027777777777777 | 43.079 |
| 0.8034722222222223 | 43.079 |
| 0.8041666666666667 | 38.653 |
| 0.8048611111111111 | 38.653 |
| 0.8055555555555555 | 34.234 |
| 0.80625 | 29.823 |
| 0.8069444444444445 | 29.823 |
| 0.8076388888888889 | 25.419 |
| 0.8083333333333332 | 25.419 |
| 0.8090277777777778 | 21.024 |
| 0.8097222222222222 | 21.024 |
| 0.8104166666666667 | 16.636 |
| 0.811111111111111 | 16.636 |
| 0.8118055555555556 | 12.257 |
| 0.8125 | 12.257 |
| 0.8131944444444444 | 12.257 |
| 0.813888888888889 | 7.887 |
| 0.8145833333333333 | 7.887 |
| 0.8152777777777778 | 7.887 |
| 0.8159722222222222 | 7.887 |
| 0.8166666666666668 | 3.525 |
| 0.8173611111111111 | 3.525 |
| 0.8180555555555555 | 3.525 |
| 0.81875 | 3.525 |
| 0.8194444444444445 | 3.525 |
| 0.8201388888888889 | 3.525 |
| 0.8208333333333333 | 3.525 |
| 0.8215277777777777 | 3.525 |
| 0.8222222222222223 | 3.525 |
| 0.8229166666666666 | 3.525 |
| 0.8236111111111111 | 3.525 |
| 0.8243055555555556 | 3.525 |
| 0.8250000000000001 | 0 |
| 0.8256944444444444 | 0 |
| 0.8263888888888888 | 0 |
| 0.8270833333333334 | 0 |
| 0.8277777777777778 | 0 |
| 0.8284722222222222 | 0 |
| 0.8291666666666666 | 0 |
| 0.8298611111111112 | 0 |
| 0.8305555555555556 | 0 |
| 0.8312499999999999 | 0 |
| 0.8319444444444444 | 0 |
| 0.8326388888888889 | 0 |
| 0.8333333333333334 | 0 |
| 0.8340277777777777 | 0 |
| 0.8347222222222223 | 0 |
| 0.8354166666666667 | 0 |
| 0.8361111111111111 | 0 |
| 0.8368055555555555 | 0 |
| 0.8375 | 0 |
| 0.8381944444444445 | 0 |
| 0.8388888888888889 | 0 |
| 0.8395833333333332 | 0 |
| 0.8402777777777778 | 0 |
| 0.8409722222222222 | 0 |
| 0.8416666666666667 | 0 |
| 0.842361111111111 | 0 |
| 0.8430555555555556 | 0 |
| 0.84375 | 0 |
| 0.8444444444444444 | 0 |
| 0.845138888888889 | 0 |
| 0.8458333333333333 | 0 |
| 0.8465277777777778 | 0 |
| 0.8472222222222222 | 0 |
| 0.8479166666666668 | 0 |
| 0.8486111111111111 | 0 |
| 0.8493055555555555 | 0 |
| 0.85 | 0 |
| 0.8506944444444445 | 0 |
| 0.8513888888888889 | 0 |
| 0.8520833333333333 | 0 |
| 0.8527777777777777 | 0 |
| 0.8534722222222223 | 0 |
| 0.8541666666666666 | 0 |
| 0.8548611111111111 | 0 |
| 0.8555555555555556 | 0 |
| 0.8562500000000001 | 0 |
| 0.8569444444444444 | 0 |
| 0.8576388888888888 | 0 |
| 0.8583333333333334 | 0 |
| 0.8590277777777778 | 0 |
| 0.8597222222222222 | 0 |
| 0.8604166666666666 | 0 |
| 0.8611111111111112 | 0 |
| 0.8618055555555556 | 0 |
| 0.8624999999999999 | 0 |
| 0.8631944444444444 | 0 |
| 0.8638888888888889 | 0 |
| 0.8645833333333334 | 0 |
| 0.8652777777777777 | 0 |
| 0.8659722222222223 | 0 |
| 0.8666666666666667 | 0 |
| 0.8673611111111111 | 0 |
| 0.8680555555555555 | 0 |
| 0.86875 | 0 |
| 0.8694444444444445 | 0 |
| 0.8701388888888889 | 0 |
| 0.8708333333333332 | 0 |
| 0.8715277777777778 | 0 |
| 0.8722222222222222 | 0 |
| 0.8729166666666667 | 0 |
| 0.873611111111111 | 0 |
| 0.8743055555555556 | 0 |
| 0.875 | 0 |
| 0.8756944444444444 | 0 |
| 0.876388888888889 | 0 |
| 0.8770833333333333 | 0 |
| 0.8777777777777778 | 0 |
| 0.8784722222222222 | 0 |
| 0.8791666666666668 | 0 |
| 0.8798611111111111 | 0 |
| 0.8805555555555555 | 0 |
| 0.88125 | 0 |
| 0.8819444444444445 | 0 |
| 0.8826388888888889 | 0 |
| 0.8833333333333333 | 0 |
| 0.8840277777777777 | 0 |
| 0.8847222222222223 | 0 |
| 0.8854166666666666 | 0 |
| 0.8861111111111111 | 0 |
| 0.8868055555555556 | 0 |
| 0.8875000000000001 | 0 |
| 0.8881944444444444 | 0 |
| 0.8888888888888888 | 0 |
| 0.8895833333333334 | 0 |
| 0.8902777777777778 | 0 |
| 0.8909722222222222 | 0 |
| 0.8916666666666666 | 0 |
| 0.8923611111111112 | 0 |
| 0.8930555555555556 | 0 |
| 0.8937499999999999 | 0 |
| 0.8944444444444444 | 0 |
| 0.8951388888888889 | 0 |
| 0.8958333333333334 | 0 |
| 0.8965277777777777 | 0 |
| 0.8972222222222223 | 0 |
| 0.8979166666666667 | 0 |
| 0.8986111111111111 | 0 |
| 0.8993055555555555 | 0 |
| 0.9 | 0 |
| 0.9006944444444445 | 0 |
| 0.9013888888888889 | 0 |
| 0.9020833333333332 | 0 |
| 0.9027777777777778 | 0 |
| 0.9034722222222222 | 0 |
| 0.9041666666666667 | 0 |
| 0.904861111111111 | 0 |
| 0.9055555555555556 | 0 |
| 0.90625 | 0 |
| 0.9069444444444444 | 0 |
| 0.907638888888889 | 0 |
| 0.9083333333333333 | 0 |
| 0.9090277777777778 | 0 |
| 0.9097222222222222 | 0 |
| 0.9104166666666668 | 0 |
| 0.9111111111111111 | 0 |
| 0.9118055555555555 | 0 |
| 0.9125 | 0 |
| 0.9131944444444445 | 0 |
| 0.9138888888888889 | 0 |
| 0.9145833333333333 | 0 |
| 0.9152777777777777 | 0 |
| 0.9159722222222223 | 0 |
| 0.9166666666666666 | 0 |
| 0.9173611111111111 | 0 |
| 0.9180555555555556 | 0 |
| 0.9187500000000001 | 0 |
| 0.9194444444444444 | 0 |
| 0.9201388888888888 | 0 |
| 0.9208333333333334 | 0 |
| 0.9215277777777778 | 0 |
| 0.9222222222222222 | 0 |
| 0.9229166666666666 | 0 |
| 0.9236111111111112 | 0 |
| 0.9243055555555556 | 0 |
| 0.9249999999999999 | 0 |
| 0.9256944444444444 | 0 |
| 0.9263888888888889 | 0 |
| 0.9270833333333334 | 0 |
| 0.9277777777777777 | 0 |
| 0.9284722222222223 | 0 |
| 0.9291666666666667 | 0 |
| 0.9298611111111111 | 0 |
| 0.9305555555555555 | 0 |
| 0.93125 | 0 |
| 0.9319444444444445 | 0 |
| 0.9326388888888889 | 0 |
| 0.9333333333333332 | 0 |
| 0.9340277777777778 | 0 |
| 0.9347222222222222 | 0 |
| 0.9354166666666667 | 0 |
| 0.936111111111111 | 0 |
| 0.9368055555555556 | 0 |
| 0.9375 | 0 |
| 0.9381944444444444 | 0 |
| 0.938888888888889 | 0 |
| 0.9395833333333333 | 0 |
| 0.9402777777777778 | 0 |
| 0.9409722222222222 | 0 |
| 0.9416666666666668 | 0 |
| 0.9423611111111111 | 0 |
| 0.9430555555555555 | 0 |
| 0.94375 | 0 |
| 0.9444444444444445 | 0 |
| 0.9451388888888889 | 0 |
| 0.9458333333333333 | 0 |
| 0.9465277777777777 | 0 |
| 0.9472222222222223 | 0 |
| 0.9479166666666666 | 0 |
| 0.9486111111111111 | 0 |
| 0.9493055555555556 | 0 |
| 0.9500000000000001 | 0 |
| 0.9506944444444444 | 0 |
| 0.9513888888888888 | 0 |
| 0.9520833333333334 | 0 |
| 0.9527777777777778 | 0 |
| 0.9534722222222222 | 0 |
| 0.9541666666666666 | 0 |
| 0.9548611111111112 | 0 |
| 0.9555555555555556 | 0 |
| 0.9562499999999999 | 0 |
| 0.9569444444444444 | 0 |
| 0.9576388888888889 | 0 |
| 0.9583333333333334 | 0 |
| 0.9590277777777777 | 0 |
| 0.9597222222222223 | 0 |
| 0.9604166666666667 | 0 |
| 0.9611111111111111 | 0 |
| 0.9618055555555555 | 0 |
| 0.9625 | 0 |
| 0.9631944444444445 | 0 |
| 0.9638888888888889 | 0 |
| 0.9645833333333332 | 0 |
| 0.9652777777777778 | 0 |
| 0.9659722222222222 | 0 |
| 0.9666666666666667 | 0 |
| 0.967361111111111 | 0 |
| 0.9680555555555556 | 0 |
| 0.96875 | 0 |
| 0.9694444444444444 | 0 |
| 0.970138888888889 | 0 |
| 0.9708333333333333 | 0 |
| 0.9715277777777778 | 0 |
| 0.9722222222222222 | 0 |
| 0.9729166666666668 | 0 |
| 0.9736111111111111 | 0 |
| 0.9743055555555555 | 0 |
| 0.975 | 0 |
| 0.9756944444444445 | 0 |
| 0.9763888888888889 | 0 |
| 0.9770833333333333 | 0 |
| 0.9777777777777777 | 0 |
| 0.9784722222222223 | 0 |
| 0.9791666666666666 | 0 |
| 0.9798611111111111 | 0 |
| 0.9805555555555556 | 0 |
| 0.9812500000000001 | 0 |
| 0.9819444444444444 | 0 |
| 0.9826388888888888 | 0 |
| 0.9833333333333334 | 0 |
| 0.9840277777777778 | 0 |
| 0.9847222222222222 | 0 |
| 0.9854166666666666 | 0 |
| 0.9861111111111112 | 0 |
| 0.9868055555555556 | 0 |
| 0.9874999999999999 | 0 |
| 0.9881944444444444 | 0 |
| 0.9888888888888889 | 0 |
| 0.9895833333333334 | 0 |
| 0.9902777777777777 | 0 |
| 0.9909722222222223 | 0 |
| 0.9916666666666667 | 0 |
| 0.9923611111111111 | 0 |
| 0.9930555555555555 | 0 |
| 0.99375 | 0 |
| 0.9944444444444445 | 0 |
| 0.9951388888888889 | 0 |
| 0.9958333333333332 | 0 |
| 0.9965277777777778 | 0 |
| 0.9972222222222222 | 0 |
| 0.9979166666666667 | 0 |
| 0.998611111111111 | 0 |
| 0.9993055555555556 | 0 |